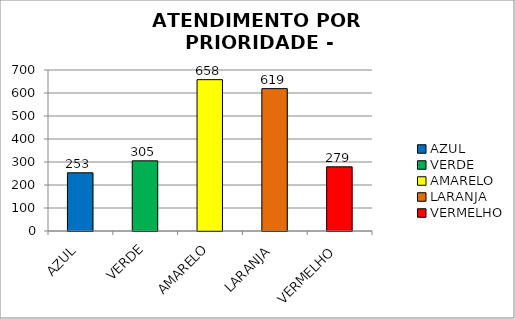
| Category | Total Regional: |
|---|---|
| AZUL | 253 |
| VERDE | 305 |
| AMARELO | 658 |
| LARANJA | 619 |
| VERMELHO | 279 |